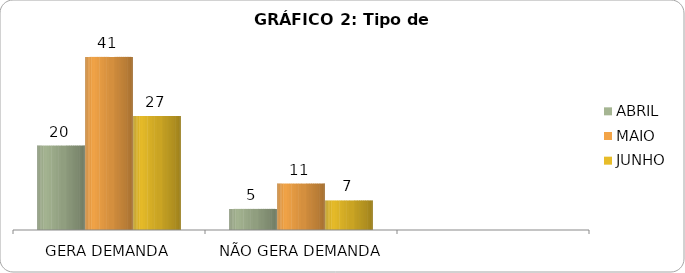
| Category | ABRIL | MAIO | JUNHO |
|---|---|---|---|
| GERA DEMANDA | 20 | 41 | 27 |
| NÃO GERA DEMANDA | 5 | 11 | 7 |